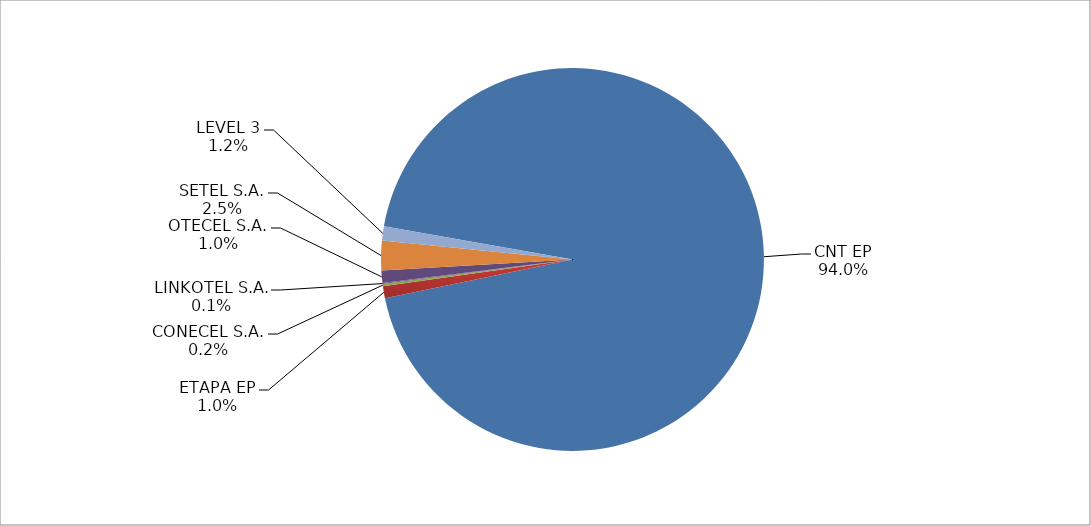
| Category | Series 0 |
|---|---|
| CNT EP | 2437 |
| ETAPA EP | 26 |
| CONECEL S.A. | 5 |
| LINKOTEL S.A. | 2 |
| OTECEL S.A. | 27 |
| SETEL S.A. | 65 |
| LEVEL 3 | 31 |